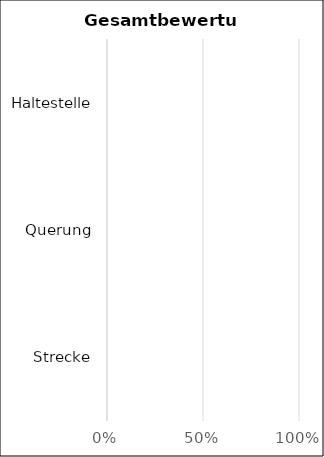
| Category | Series 0 |
|---|---|
| Strecke | 0 |
| Querung | 0 |
| Haltestelle | 0 |